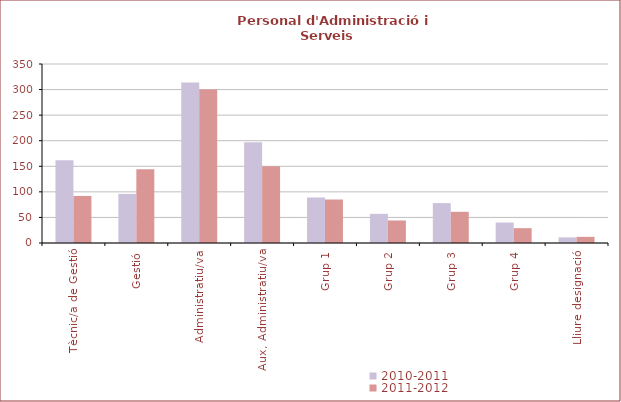
| Category | 2010-2011 | 2011-2012 |
|---|---|---|
| Tècnic/a de Gestió | 162 | 92 |
| Gestió | 96 | 144 |
| Administratiu/va | 314 | 300 |
| Aux, Administratiu/va | 197 | 150 |
| Grup 1 | 89 | 85 |
| Grup 2 | 57 | 44 |
| Grup 3 | 78 | 61 |
| Grup 4 | 40 | 29 |
| Lliure designació | 11 | 12 |